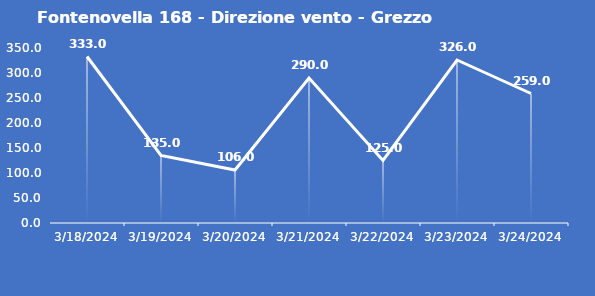
| Category | Fontenovella 168 - Direzione vento - Grezzo (°N) |
|---|---|
| 3/18/24 | 333 |
| 3/19/24 | 135 |
| 3/20/24 | 106 |
| 3/21/24 | 290 |
| 3/22/24 | 125 |
| 3/23/24 | 326 |
| 3/24/24 | 259 |